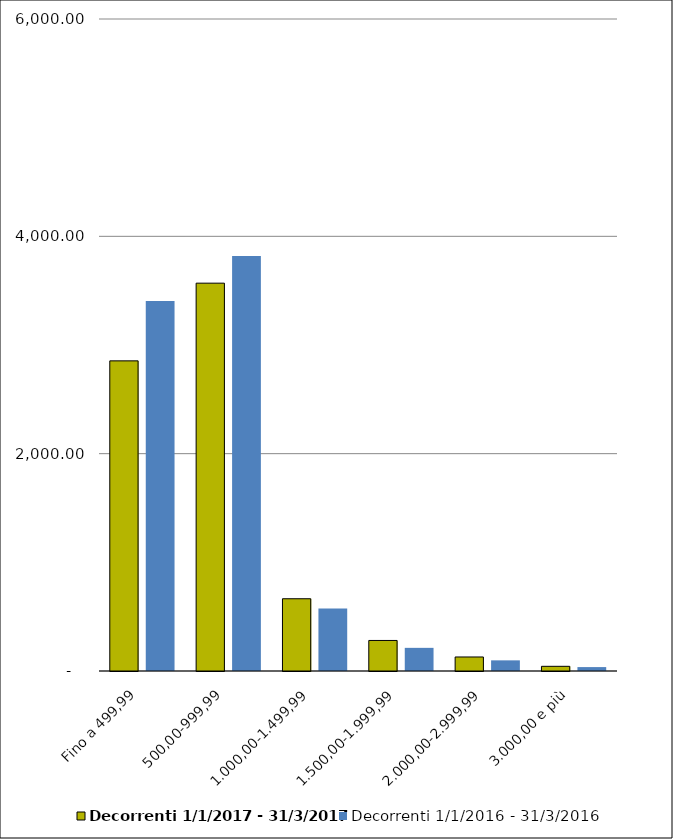
| Category | Decorrenti 1/1/2017 - 31/3/2017 | Decorrenti 1/1/2016 - 31/3/2016 |
|---|---|---|
| Fino a 499,99 | 2854 | 3404 |
| 500,00-999,99 | 3569 | 3820 |
| 1.000,00-1.499,99 | 665 | 576 |
| 1.500,00-1.999,99 | 281 | 213 |
| 2.000,00-2.999,99 | 129 | 98 |
| 3.000,00 e più | 43 | 36 |